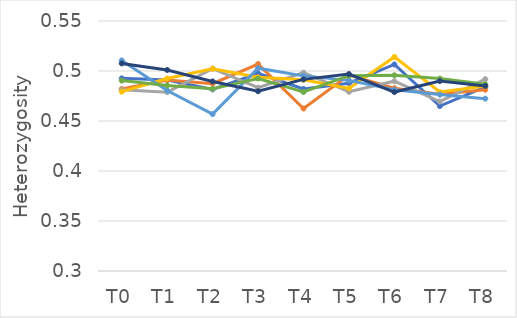
| Category | H1 | H2 | H3 | H4 | H5 | H6 | H7 |
|---|---|---|---|---|---|---|---|
| T0 | 0.493 | 0.482 | 0.481 | 0.479 | 0.511 | 0.49 | 0.508 |
| T1 | 0.491 | 0.491 | 0.479 | 0.492 | 0.48 | 0.486 | 0.501 |
| T2 | 0.482 | 0.487 | 0.502 | 0.502 | 0.457 | 0.482 | 0.49 |
| T3 | 0.498 | 0.507 | 0.483 | 0.494 | 0.503 | 0.492 | 0.48 |
| T4 | 0.482 | 0.462 | 0.498 | 0.491 | 0.495 | 0.479 | 0.492 |
| T5 | 0.488 | 0.496 | 0.479 | 0.483 | 0.491 | 0.495 | 0.497 |
| T6 | 0.507 | 0.483 | 0.49 | 0.514 | 0.481 | 0.496 | 0.479 |
| T7 | 0.465 | 0.477 | 0.469 | 0.479 | 0.476 | 0.492 | 0.49 |
| T8 | 0.484 | 0.481 | 0.492 | 0.485 | 0.472 | 0.487 | 0.485 |